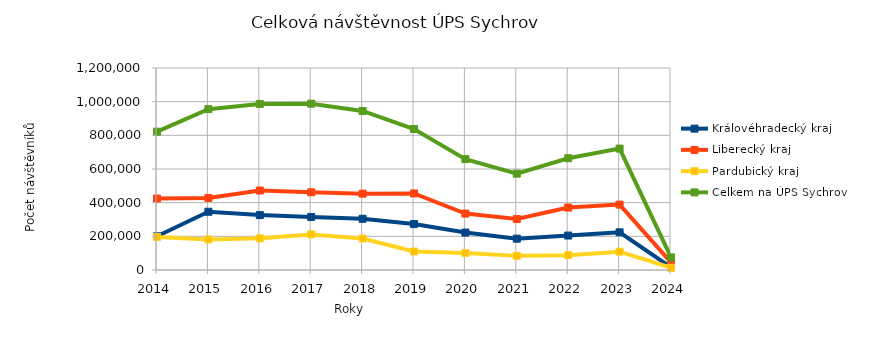
| Category | Královéhradecký kraj | Liberecký kraj | Pardubický kraj | Celkem na ÚPS Sychrov |
|---|---|---|---|---|
| 2014.0 | 200438 | 424718 | 196473 | 821629 |
| 2015.0 | 345970 | 428023 | 181567 | 955560 |
| 2016.0 | 326137 | 472318 | 188108 | 986563 |
| 2017.0 | 314983 | 461803 | 211268 | 988054 |
| 2018.0 | 304267 | 453568 | 187017 | 944852 |
| 2019.0 | 272720 | 454785 | 109949 | 837454 |
| 2020.0 | 222238 | 335261 | 101211 | 658710 |
| 2021.0 | 185934 | 302574 | 83925 | 572433 |
| 2022.0 | 204678 | 371041 | 88282 | 664001 |
| 2023.0 | 223799 | 388530 | 108959 | 721288 |
| 2024.0 | 16179 | 45411 | 13544 | 75134 |